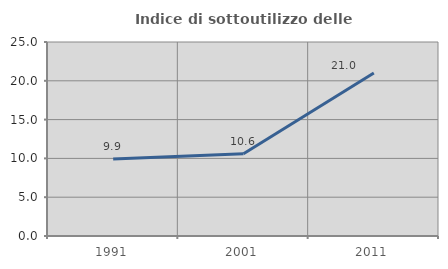
| Category | Indice di sottoutilizzo delle abitazioni  |
|---|---|
| 1991.0 | 9.934 |
| 2001.0 | 10.606 |
| 2011.0 | 21.008 |